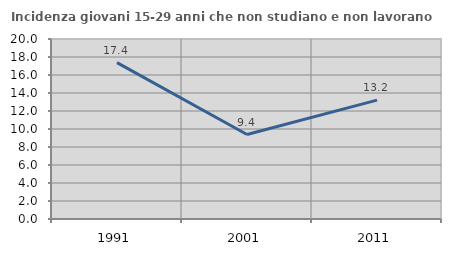
| Category | Incidenza giovani 15-29 anni che non studiano e non lavorano  |
|---|---|
| 1991.0 | 17.376 |
| 2001.0 | 9.383 |
| 2011.0 | 13.208 |